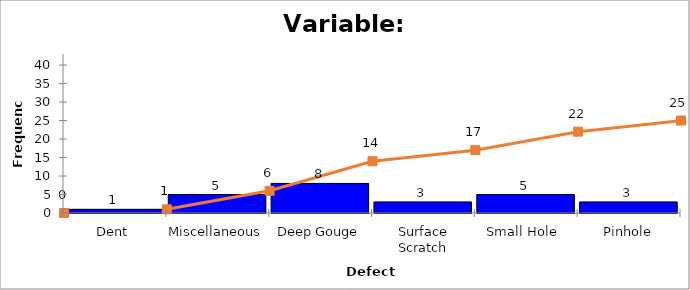
| Category | Freq |
|---|---|
| Dent | 1 |
| Miscellaneous | 5 |
| Deep Gouge | 8 |
| Surface Scratch | 3 |
| Small Hole  | 5 |
| Pinhole | 3 |